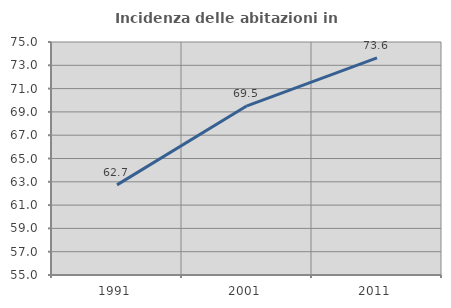
| Category | Incidenza delle abitazioni in proprietà  |
|---|---|
| 1991.0 | 62.734 |
| 2001.0 | 69.521 |
| 2011.0 | 73.644 |